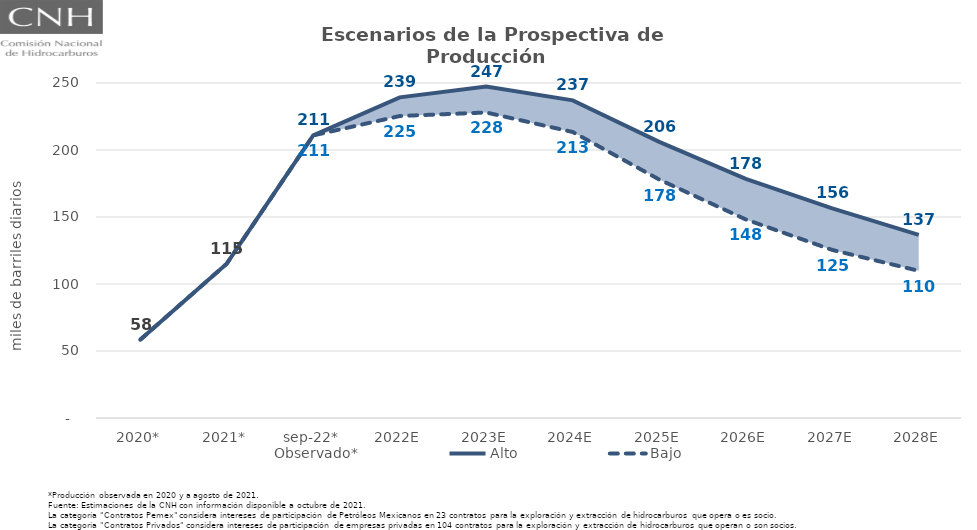
| Category | Observado* | Alto | Bajo |
|---|---|---|---|
| 2020* | 58.421 | 58.421 | 58.421 |
| 2021* | 115.166 | 115.166 | 115.166 |
| sep-22* | 210.883 | 210.883 | 210.883 |
| 2022E | 230.623 | 239.262 | 225.356 |
| 2023E | 233.737 | 247.348 | 227.997 |
| 2024E | 220.901 | 237.025 | 213.428 |
| 2025E | 189.089 | 206.055 | 177.962 |
| 2026E | 161.79 | 178.45 | 148.19 |
| 2027E | 140.11 | 156.399 | 125.412 |
| 2028E | 125.321 | 136.607 | 109.839 |